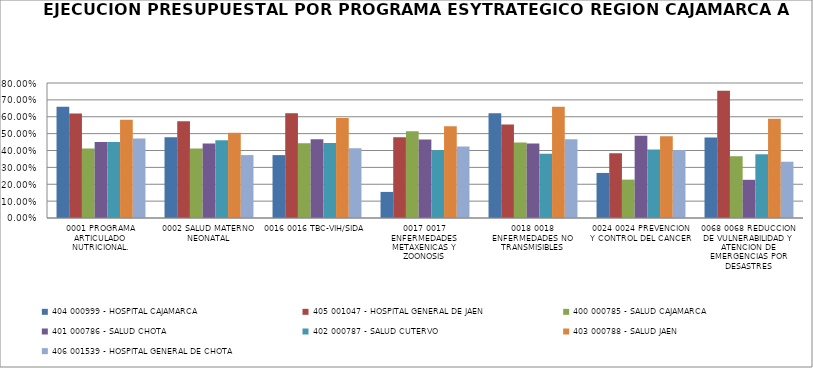
| Category | 404 000999 - HOSPITAL CAJAMARCA | 405 001047 - HOSPITAL GENERAL DE JAEN | 400 000785 - SALUD CAJAMARCA | 401 000786 - SALUD CHOTA | 402 000787 - SALUD CUTERVO | 403 000788 - SALUD JAEN | 406 001539 - HOSPITAL GENERAL DE CHOTA |
|---|---|---|---|---|---|---|---|
| 0001 PROGRAMA ARTICULADO NUTRICIONAL. | 0.659 | 0.619 | 0.412 | 0.45 | 0.45 | 0.582 | 0.471 |
| 0002 SALUD MATERNO NEONATAL | 0.479 | 0.573 | 0.412 | 0.441 | 0.46 | 0.506 | 0.373 |
| 0016 0016 TBC-VIH/SIDA | 0.373 | 0.62 | 0.443 | 0.467 | 0.444 | 0.593 | 0.414 |
| 0017 0017 ENFERMEDADES METAXENICAS Y ZOONOSIS | 0.155 | 0.478 | 0.514 | 0.465 | 0.402 | 0.543 | 0.423 |
| 0018 0018 ENFERMEDADES NO TRANSMISIBLES | 0.621 | 0.554 | 0.447 | 0.442 | 0.381 | 0.66 | 0.467 |
| 0024 0024 PREVENCION Y CONTROL DEL CANCER | 0.267 | 0.384 | 0.227 | 0.487 | 0.406 | 0.484 | 0.403 |
| 0068 0068 REDUCCION DE VULNERABILIDAD Y ATENCION DE EMERGENCIAS POR DESASTRES | 0.477 | 0.755 | 0.366 | 0.226 | 0.378 | 0.588 | 0.334 |